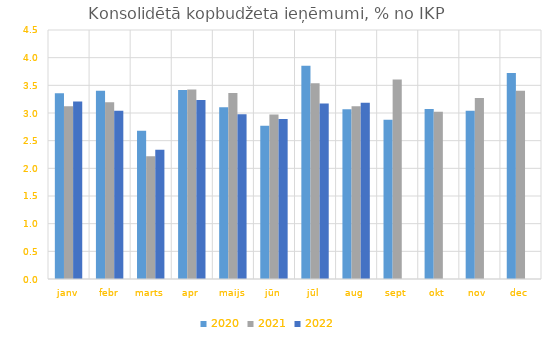
| Category | 2020 | 2021 | 2022 |
|---|---|---|---|
| janv | 3.356 | 3.121 | 3.207 |
| febr | 3.402 | 3.195 | 3.04 |
| marts | 2.68 | 2.219 | 2.336 |
| apr | 3.417 | 3.426 | 3.234 |
| maijs | 3.103 | 3.36 | 2.976 |
| jūn | 2.77 | 2.971 | 2.894 |
| jūl | 3.854 | 3.537 | 3.174 |
| aug | 3.069 | 3.121 | 3.185 |
| sept | 2.876 | 3.605 | 0 |
| okt | 3.071 | 3.023 | 0 |
| nov | 3.04 | 3.271 | 0 |
| dec | 3.723 | 3.404 | 0 |